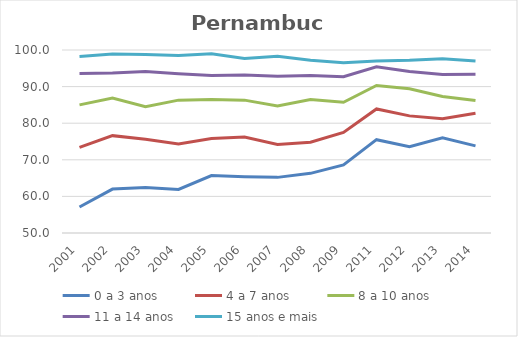
| Category | 0 a 3 anos | 4 a 7 anos | 8 a 10 anos | 11 a 14 anos | 15 anos e mais |
|---|---|---|---|---|---|
| 2001.0 | 57.1 | 73.4 | 85 | 93.6 | 98.2 |
| 2002.0 | 62 | 76.6 | 86.9 | 93.7 | 98.9 |
| 2003.0 | 62.4 | 75.6 | 84.5 | 94.1 | 98.8 |
| 2004.0 | 61.9 | 74.3 | 86.3 | 93.5 | 98.5 |
| 2005.0 | 65.7 | 75.8 | 86.5 | 93 | 99 |
| 2006.0 | 65.4 | 76.2 | 86.3 | 93.2 | 97.7 |
| 2007.0 | 65.2 | 74.2 | 84.7 | 92.8 | 98.3 |
| 2008.0 | 66.3 | 74.8 | 86.5 | 93 | 97.2 |
| 2009.0 | 68.6 | 77.5 | 85.7 | 92.7 | 96.5 |
| 2011.0 | 75.5 | 83.9 | 90.3 | 95.4 | 97 |
| 2012.0 | 73.6 | 82 | 89.4 | 94.1 | 97.2 |
| 2013.0 | 76 | 81.2 | 87.3 | 93.3 | 97.6 |
| 2014.0 | 73.8 | 82.7 | 86.2 | 93.4 | 97 |